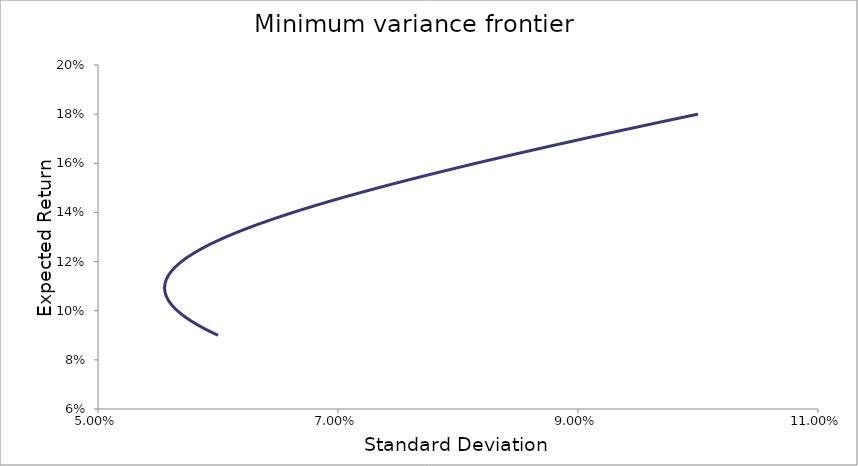
| Category | Minimum variance frontier |
|---|---|
| 0.06 | 0.09 |
| 0.05960805314720487 | 0.091 |
| 0.05923242355332086 | 0.092 |
| 0.05887342354577318 | 0.093 |
| 0.05853135911628911 | 0.094 |
| 0.058206528843420986 | 0.094 |
| 0.057899222792711126 | 0.095 |
| 0.05760972140186064 | 0.096 |
| 0.05733829435900583 | 0.097 |
| 0.05708519948287822 | 0.098 |
| 0.05685068161420759 | 0.099 |
| 0.05663497152819978 | 0.1 |
| 0.056438284878263266 | 0.101 |
| 0.056260821181351416 | 0.102 |
| 0.05610276285531756 | 0.103 |
| 0.05596427431853288 | 0.104 |
| 0.05584550116168714 | 0.104 |
| 0.05574656940117481 | 0.105 |
| 0.055667584822767374 | 0.106 |
| 0.05560863242339269 | 0.107 |
| 0.055569775957799224 | 0.108 |
| 0.055551057595692996 | 0.109 |
| 0.0555524976936231 | 0.11 |
| 0.05557409468448407 | 0.111 |
| 0.05561582508603105 | 0.112 |
| 0.055677643628300216 | 0.112 |
| 0.0557594834983252 | 0.113 |
| 0.055861256699075434 | 0.114 |
| 0.0559828545181469 | 0.115 |
| 0.056124148100438906 | 0.116 |
| 0.05628498911788115 | 0.117 |
| 0.05646521052825359 | 0.118 |
| 0.0566646274142873 | 0.119 |
| 0.056883037893558384 | 0.12 |
| 0.057120224089196286 | 0.121 |
| 0.05737595315112421 | 0.122 |
| 0.057649978317428706 | 0.122 |
| 0.057942040005508955 | 0.123 |
| 0.0582518669228721 | 0.124 |
| 0.05857917718780284 | 0.125 |
| 0.05892367945062495 | 0.126 |
| 0.05928507400686956 | 0.127 |
| 0.05966305389434906 | 0.128 |
| 0.06005730596688467 | 0.129 |
| 0.060467511938230106 | 0.13 |
| 0.06089334939055332 | 0.13 |
| 0.0613344927426648 | 0.131 |
| 0.061790614173998955 | 0.132 |
| 0.062261384501149666 | 0.133 |
| 0.06274647400452077 | 0.134 |
| 0.06324555320336758 | 0.135 |
| 0.0637582935781691 | 0.136 |
| 0.06428436823987618 | 0.137 |
| 0.06482345254612716 | 0.138 |
| 0.06537522466500593 | 0.139 |
| 0.06593936608733815 | 0.14 |
| 0.06651556208888264 | 0.14 |
| 0.06710350214407591 | 0.141 |
| 0.06770288029323421 | 0.142 |
| 0.06831339546531119 | 0.143 |
| 0.06893475175845636 | 0.144 |
| 0.06956665868072148 | 0.145 |
| 0.07020883135332763 | 0.146 |
| 0.07086099067893421 | 0.147 |
| 0.07152286347735247 | 0.148 |
| 0.07219418259112019 | 0.148 |
| 0.0728746869633071 | 0.149 |
| 0.0735641216898564 | 0.15 |
| 0.07426223804868798 | 0.151 |
| 0.07496879350769893 | 0.152 |
| 0.07568355171369802 | 0.153 |
| 0.07640628246420579 | 0.154 |
| 0.07713676166394336 | 0.155 |
| 0.07787477126772188 | 0.156 |
| 0.078620099211334 | 0.157 |
| 0.07937253933193773 | 0.158 |
| 0.08013189127931526 | 0.158 |
| 0.08089796041928375 | 0.159 |
| 0.08167055773043308 | 0.16 |
| 0.08244949969526803 | 0.161 |
| 0.08323460818673926 | 0.162 |
| 0.08402571035105864 | 0.163 |
| 0.08482263848761132 | 0.164 |
| 0.08562522992669859 | 0.165 |
| 0.08643332690577171 | 0.166 |
| 0.08724677644474896 | 0.166 |
| 0.08806543022094425 | 0.167 |
| 0.0888891444440771 | 0.168 |
| 0.08971777973177893 | 0.169 |
| 0.09055120098596153 | 0.17 |
| 0.0913892772703669 | 0.171 |
| 0.09223188168957631 | 0.172 |
| 0.09307889126971809 | 0.173 |
| 0.09393018684107896 | 0.174 |
| 0.09478565292279206 | 0.175 |
| 0.09564517760974675 | 0.176 |
| 0.0965086524618389 | 0.176 |
| 0.09737597239565826 | 0.177 |
| 0.09824703557868808 | 0.178 |
| 0.09912174332607353 | 0.179 |
| 0.1 | 0.18 |